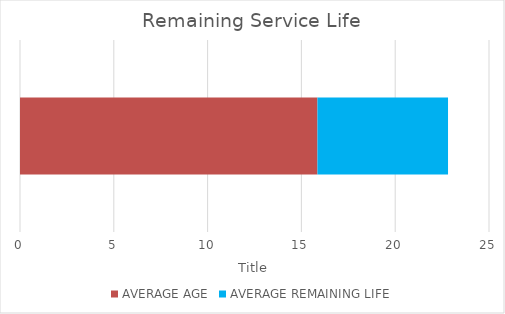
| Category | AVERAGE AGE | AVERAGE REMAINING LIFE |
|---|---|---|
| BACKLOG % OF TOTAL ASSET VALUE | 15.855 | 6.96 |